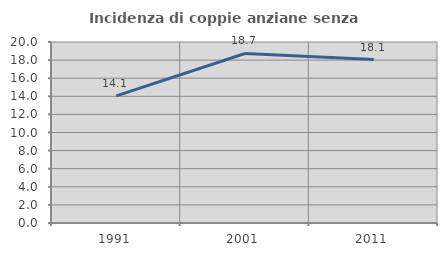
| Category | Incidenza di coppie anziane senza figli  |
|---|---|
| 1991.0 | 14.054 |
| 2001.0 | 18.734 |
| 2011.0 | 18.059 |